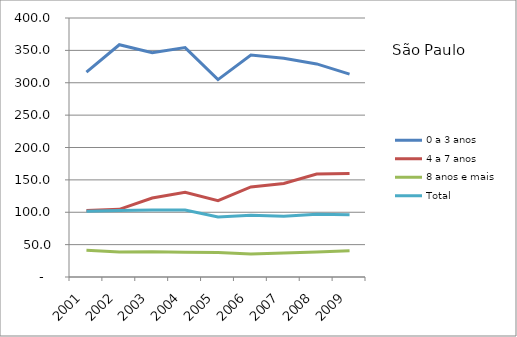
| Category | 0 a 3 anos | 4 a 7 anos | 8 anos e mais | Total |
|---|---|---|---|---|
| 2001.0 | 316.5 | 102.8 | 41.4 | 101.7 |
| 2002.0 | 358.7 | 104.5 | 38.5 | 102.7 |
| 2003.0 | 346.5 | 121.9 | 39 | 103.6 |
| 2004.0 | 354.3 | 130.7 | 38.3 | 103.3 |
| 2005.0 | 304.8 | 117.9 | 37.8 | 92.7 |
| 2006.0 | 342.9 | 139.1 | 35.5 | 95.5 |
| 2007.0 | 337.9 | 144.3 | 37 | 93.9 |
| 2008.0 | 329.1 | 159 | 38.7 | 96.9 |
| 2009.0 | 313.3 | 159.7 | 40.4 | 96 |